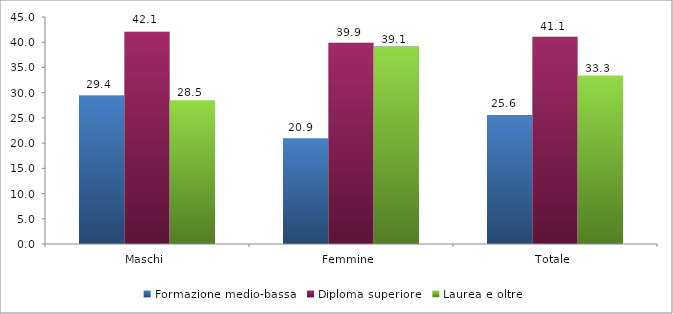
| Category | Formazione medio-bassa | Diploma superiore | Laurea e oltre |
|---|---|---|---|
| Maschi | 29.432 | 42.065 | 28.503 |
| Femmine | 20.943 | 39.91 | 39.147 |
| Totale | 25.581 | 41.087 | 33.332 |